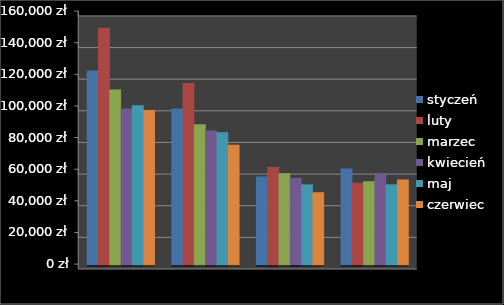
| Category | styczeń | luty | marzec | kwiecień | maj | czerwiec |
|---|---|---|---|---|---|---|
| Książki | 123000 | 150000 | 111000 | 99000 | 101000 | 98000 |
| Muzyka | 99000 | 115000 | 89000 | 85000 | 84000 | 76000 |
| Filmy | 56000 | 62000 | 58000 | 55000 | 51000 | 46000 |
| Multimedia | 61000 | 52000 | 53000 | 58000 | 51000 | 54000 |